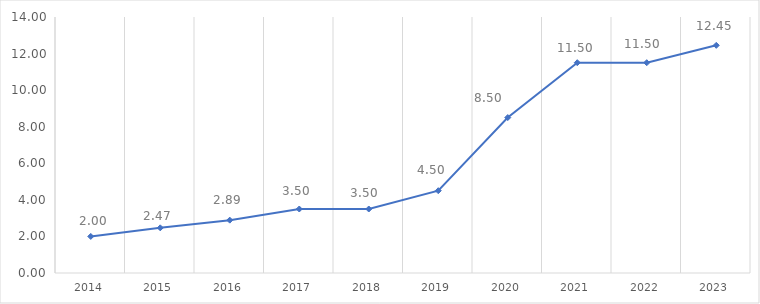
| Category | Series 0 |
|---|---|
| 2014.0 | 2 |
| 2015.0 | 2.47 |
| 2016.0 | 2.89 |
| 2017.0 | 3.5 |
| 2018.0 | 3.5 |
| 2019.0 | 4.5 |
| 2020.0 | 8.5 |
| 2021.0 | 11.5 |
| 2022.0 | 11.5 |
| 2023.0 | 12.45 |